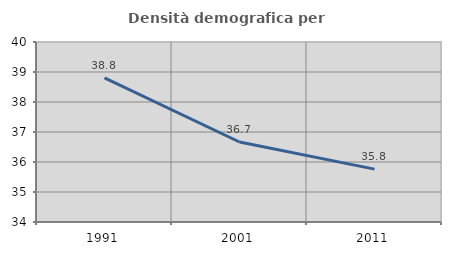
| Category | Densità demografica |
|---|---|
| 1991.0 | 38.801 |
| 2001.0 | 36.666 |
| 2011.0 | 35.763 |